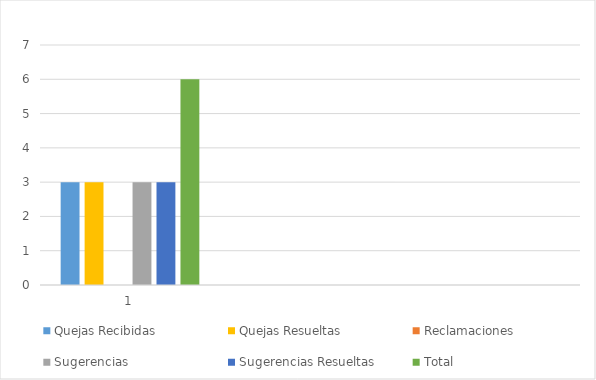
| Category | Quejas Recibidas | Quejas Resueltas | Reclamaciones | Sugerencias | Sugerencias Resueltas | Total |
|---|---|---|---|---|---|---|
| 1.0 | 3 | 3 | 0 | 3 | 3 | 6 |